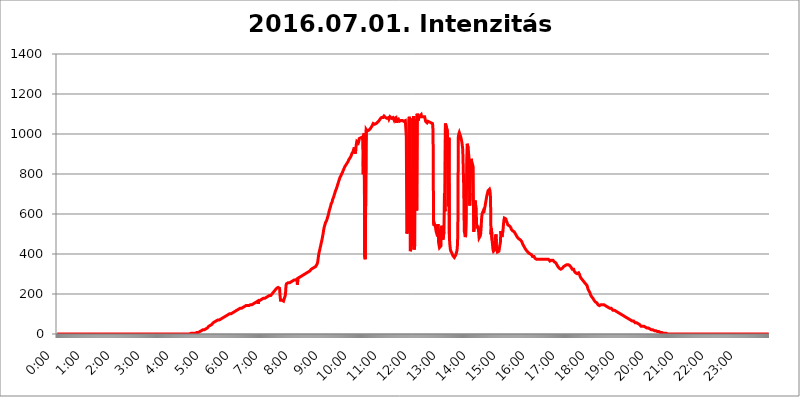
| Category | 2016.07.01. Intenzitás [W/m^2] |
|---|---|
| 0.0 | 0 |
| 0.0006944444444444445 | 0 |
| 0.001388888888888889 | 0 |
| 0.0020833333333333333 | 0 |
| 0.002777777777777778 | 0 |
| 0.003472222222222222 | 0 |
| 0.004166666666666667 | 0 |
| 0.004861111111111111 | 0 |
| 0.005555555555555556 | 0 |
| 0.0062499999999999995 | 0 |
| 0.006944444444444444 | 0 |
| 0.007638888888888889 | 0 |
| 0.008333333333333333 | 0 |
| 0.009027777777777779 | 0 |
| 0.009722222222222222 | 0 |
| 0.010416666666666666 | 0 |
| 0.011111111111111112 | 0 |
| 0.011805555555555555 | 0 |
| 0.012499999999999999 | 0 |
| 0.013194444444444444 | 0 |
| 0.013888888888888888 | 0 |
| 0.014583333333333332 | 0 |
| 0.015277777777777777 | 0 |
| 0.015972222222222224 | 0 |
| 0.016666666666666666 | 0 |
| 0.017361111111111112 | 0 |
| 0.018055555555555557 | 0 |
| 0.01875 | 0 |
| 0.019444444444444445 | 0 |
| 0.02013888888888889 | 0 |
| 0.020833333333333332 | 0 |
| 0.02152777777777778 | 0 |
| 0.022222222222222223 | 0 |
| 0.02291666666666667 | 0 |
| 0.02361111111111111 | 0 |
| 0.024305555555555556 | 0 |
| 0.024999999999999998 | 0 |
| 0.025694444444444447 | 0 |
| 0.02638888888888889 | 0 |
| 0.027083333333333334 | 0 |
| 0.027777777777777776 | 0 |
| 0.02847222222222222 | 0 |
| 0.029166666666666664 | 0 |
| 0.029861111111111113 | 0 |
| 0.030555555555555555 | 0 |
| 0.03125 | 0 |
| 0.03194444444444445 | 0 |
| 0.03263888888888889 | 0 |
| 0.03333333333333333 | 0 |
| 0.034027777777777775 | 0 |
| 0.034722222222222224 | 0 |
| 0.035416666666666666 | 0 |
| 0.036111111111111115 | 0 |
| 0.03680555555555556 | 0 |
| 0.0375 | 0 |
| 0.03819444444444444 | 0 |
| 0.03888888888888889 | 0 |
| 0.03958333333333333 | 0 |
| 0.04027777777777778 | 0 |
| 0.04097222222222222 | 0 |
| 0.041666666666666664 | 0 |
| 0.042361111111111106 | 0 |
| 0.04305555555555556 | 0 |
| 0.043750000000000004 | 0 |
| 0.044444444444444446 | 0 |
| 0.04513888888888889 | 0 |
| 0.04583333333333334 | 0 |
| 0.04652777777777778 | 0 |
| 0.04722222222222222 | 0 |
| 0.04791666666666666 | 0 |
| 0.04861111111111111 | 0 |
| 0.049305555555555554 | 0 |
| 0.049999999999999996 | 0 |
| 0.05069444444444445 | 0 |
| 0.051388888888888894 | 0 |
| 0.052083333333333336 | 0 |
| 0.05277777777777778 | 0 |
| 0.05347222222222222 | 0 |
| 0.05416666666666667 | 0 |
| 0.05486111111111111 | 0 |
| 0.05555555555555555 | 0 |
| 0.05625 | 0 |
| 0.05694444444444444 | 0 |
| 0.057638888888888885 | 0 |
| 0.05833333333333333 | 0 |
| 0.05902777777777778 | 0 |
| 0.059722222222222225 | 0 |
| 0.06041666666666667 | 0 |
| 0.061111111111111116 | 0 |
| 0.06180555555555556 | 0 |
| 0.0625 | 0 |
| 0.06319444444444444 | 0 |
| 0.06388888888888888 | 0 |
| 0.06458333333333334 | 0 |
| 0.06527777777777778 | 0 |
| 0.06597222222222222 | 0 |
| 0.06666666666666667 | 0 |
| 0.06736111111111111 | 0 |
| 0.06805555555555555 | 0 |
| 0.06874999999999999 | 0 |
| 0.06944444444444443 | 0 |
| 0.07013888888888889 | 0 |
| 0.07083333333333333 | 0 |
| 0.07152777777777779 | 0 |
| 0.07222222222222223 | 0 |
| 0.07291666666666667 | 0 |
| 0.07361111111111111 | 0 |
| 0.07430555555555556 | 0 |
| 0.075 | 0 |
| 0.07569444444444444 | 0 |
| 0.0763888888888889 | 0 |
| 0.07708333333333334 | 0 |
| 0.07777777777777778 | 0 |
| 0.07847222222222222 | 0 |
| 0.07916666666666666 | 0 |
| 0.0798611111111111 | 0 |
| 0.08055555555555556 | 0 |
| 0.08125 | 0 |
| 0.08194444444444444 | 0 |
| 0.08263888888888889 | 0 |
| 0.08333333333333333 | 0 |
| 0.08402777777777777 | 0 |
| 0.08472222222222221 | 0 |
| 0.08541666666666665 | 0 |
| 0.08611111111111112 | 0 |
| 0.08680555555555557 | 0 |
| 0.08750000000000001 | 0 |
| 0.08819444444444445 | 0 |
| 0.08888888888888889 | 0 |
| 0.08958333333333333 | 0 |
| 0.09027777777777778 | 0 |
| 0.09097222222222222 | 0 |
| 0.09166666666666667 | 0 |
| 0.09236111111111112 | 0 |
| 0.09305555555555556 | 0 |
| 0.09375 | 0 |
| 0.09444444444444444 | 0 |
| 0.09513888888888888 | 0 |
| 0.09583333333333333 | 0 |
| 0.09652777777777777 | 0 |
| 0.09722222222222222 | 0 |
| 0.09791666666666667 | 0 |
| 0.09861111111111111 | 0 |
| 0.09930555555555555 | 0 |
| 0.09999999999999999 | 0 |
| 0.10069444444444443 | 0 |
| 0.1013888888888889 | 0 |
| 0.10208333333333335 | 0 |
| 0.10277777777777779 | 0 |
| 0.10347222222222223 | 0 |
| 0.10416666666666667 | 0 |
| 0.10486111111111111 | 0 |
| 0.10555555555555556 | 0 |
| 0.10625 | 0 |
| 0.10694444444444444 | 0 |
| 0.1076388888888889 | 0 |
| 0.10833333333333334 | 0 |
| 0.10902777777777778 | 0 |
| 0.10972222222222222 | 0 |
| 0.1111111111111111 | 0 |
| 0.11180555555555556 | 0 |
| 0.11180555555555556 | 0 |
| 0.1125 | 0 |
| 0.11319444444444444 | 0 |
| 0.11388888888888889 | 0 |
| 0.11458333333333333 | 0 |
| 0.11527777777777777 | 0 |
| 0.11597222222222221 | 0 |
| 0.11666666666666665 | 0 |
| 0.1173611111111111 | 0 |
| 0.11805555555555557 | 0 |
| 0.11944444444444445 | 0 |
| 0.12013888888888889 | 0 |
| 0.12083333333333333 | 0 |
| 0.12152777777777778 | 0 |
| 0.12222222222222223 | 0 |
| 0.12291666666666667 | 0 |
| 0.12291666666666667 | 0 |
| 0.12361111111111112 | 0 |
| 0.12430555555555556 | 0 |
| 0.125 | 0 |
| 0.12569444444444444 | 0 |
| 0.12638888888888888 | 0 |
| 0.12708333333333333 | 0 |
| 0.16875 | 0 |
| 0.12847222222222224 | 0 |
| 0.12916666666666668 | 0 |
| 0.12986111111111112 | 0 |
| 0.13055555555555556 | 0 |
| 0.13125 | 0 |
| 0.13194444444444445 | 0 |
| 0.1326388888888889 | 0 |
| 0.13333333333333333 | 0 |
| 0.13402777777777777 | 0 |
| 0.13402777777777777 | 0 |
| 0.13472222222222222 | 0 |
| 0.13541666666666666 | 0 |
| 0.1361111111111111 | 0 |
| 0.13749999999999998 | 0 |
| 0.13819444444444443 | 0 |
| 0.1388888888888889 | 0 |
| 0.13958333333333334 | 0 |
| 0.14027777777777778 | 0 |
| 0.14097222222222222 | 0 |
| 0.14166666666666666 | 0 |
| 0.1423611111111111 | 0 |
| 0.14305555555555557 | 0 |
| 0.14375000000000002 | 0 |
| 0.14444444444444446 | 0 |
| 0.1451388888888889 | 0 |
| 0.1451388888888889 | 0 |
| 0.14652777777777778 | 0 |
| 0.14722222222222223 | 0 |
| 0.14791666666666667 | 0 |
| 0.1486111111111111 | 0 |
| 0.14930555555555555 | 0 |
| 0.15 | 0 |
| 0.15069444444444444 | 0 |
| 0.15138888888888888 | 0 |
| 0.15208333333333332 | 0 |
| 0.15277777777777776 | 0 |
| 0.15347222222222223 | 0 |
| 0.15416666666666667 | 0 |
| 0.15486111111111112 | 0 |
| 0.15555555555555556 | 0 |
| 0.15625 | 0 |
| 0.15694444444444444 | 0 |
| 0.15763888888888888 | 0 |
| 0.15833333333333333 | 0 |
| 0.15902777777777777 | 0 |
| 0.15972222222222224 | 0 |
| 0.16041666666666668 | 0 |
| 0.16111111111111112 | 0 |
| 0.16180555555555556 | 0 |
| 0.1625 | 0 |
| 0.16319444444444445 | 0 |
| 0.1638888888888889 | 0 |
| 0.16458333333333333 | 0 |
| 0.16527777777777777 | 0 |
| 0.16597222222222222 | 0 |
| 0.16666666666666666 | 0 |
| 0.1673611111111111 | 0 |
| 0.16805555555555554 | 0 |
| 0.16874999999999998 | 0 |
| 0.16944444444444443 | 0 |
| 0.17013888888888887 | 0 |
| 0.1708333333333333 | 0 |
| 0.17152777777777775 | 0 |
| 0.17222222222222225 | 0 |
| 0.1729166666666667 | 0 |
| 0.17361111111111113 | 0 |
| 0.17430555555555557 | 0 |
| 0.17500000000000002 | 0 |
| 0.17569444444444446 | 0 |
| 0.1763888888888889 | 0 |
| 0.17708333333333334 | 0 |
| 0.17777777777777778 | 0 |
| 0.17847222222222223 | 0 |
| 0.17916666666666667 | 0 |
| 0.1798611111111111 | 0 |
| 0.18055555555555555 | 0 |
| 0.18125 | 0 |
| 0.18194444444444444 | 0 |
| 0.1826388888888889 | 0 |
| 0.18333333333333335 | 0 |
| 0.1840277777777778 | 0 |
| 0.18472222222222223 | 0 |
| 0.18541666666666667 | 0 |
| 0.18611111111111112 | 0 |
| 0.18680555555555556 | 0 |
| 0.1875 | 3.525 |
| 0.18819444444444444 | 3.525 |
| 0.18888888888888888 | 3.525 |
| 0.18958333333333333 | 3.525 |
| 0.19027777777777777 | 3.525 |
| 0.1909722222222222 | 3.525 |
| 0.19166666666666665 | 3.525 |
| 0.19236111111111112 | 3.525 |
| 0.19305555555555554 | 3.525 |
| 0.19375 | 3.525 |
| 0.19444444444444445 | 7.887 |
| 0.1951388888888889 | 7.887 |
| 0.19583333333333333 | 7.887 |
| 0.19652777777777777 | 7.887 |
| 0.19722222222222222 | 7.887 |
| 0.19791666666666666 | 7.887 |
| 0.1986111111111111 | 12.257 |
| 0.19930555555555554 | 12.257 |
| 0.19999999999999998 | 12.257 |
| 0.20069444444444443 | 12.257 |
| 0.20138888888888887 | 12.257 |
| 0.2020833333333333 | 16.636 |
| 0.2027777777777778 | 16.636 |
| 0.2034722222222222 | 16.636 |
| 0.2041666666666667 | 21.024 |
| 0.20486111111111113 | 21.024 |
| 0.20555555555555557 | 21.024 |
| 0.20625000000000002 | 21.024 |
| 0.20694444444444446 | 21.024 |
| 0.2076388888888889 | 21.024 |
| 0.20833333333333334 | 25.419 |
| 0.20902777777777778 | 25.419 |
| 0.20972222222222223 | 25.419 |
| 0.21041666666666667 | 29.823 |
| 0.2111111111111111 | 34.234 |
| 0.21180555555555555 | 34.234 |
| 0.2125 | 38.653 |
| 0.21319444444444444 | 38.653 |
| 0.2138888888888889 | 43.079 |
| 0.21458333333333335 | 43.079 |
| 0.2152777777777778 | 47.511 |
| 0.21597222222222223 | 47.511 |
| 0.21666666666666667 | 47.511 |
| 0.21736111111111112 | 51.951 |
| 0.21805555555555556 | 51.951 |
| 0.21875 | 56.398 |
| 0.21944444444444444 | 56.398 |
| 0.22013888888888888 | 56.398 |
| 0.22083333333333333 | 60.85 |
| 0.22152777777777777 | 60.85 |
| 0.2222222222222222 | 60.85 |
| 0.22291666666666665 | 65.31 |
| 0.2236111111111111 | 65.31 |
| 0.22430555555555556 | 65.31 |
| 0.225 | 69.775 |
| 0.22569444444444445 | 69.775 |
| 0.2263888888888889 | 69.775 |
| 0.22708333333333333 | 69.775 |
| 0.22777777777777777 | 74.246 |
| 0.22847222222222222 | 74.246 |
| 0.22916666666666666 | 74.246 |
| 0.2298611111111111 | 74.246 |
| 0.23055555555555554 | 78.722 |
| 0.23124999999999998 | 78.722 |
| 0.23194444444444443 | 78.722 |
| 0.23263888888888887 | 83.205 |
| 0.2333333333333333 | 83.205 |
| 0.2340277777777778 | 83.205 |
| 0.2347222222222222 | 83.205 |
| 0.2354166666666667 | 87.692 |
| 0.23611111111111113 | 87.692 |
| 0.23680555555555557 | 87.692 |
| 0.23750000000000002 | 92.184 |
| 0.23819444444444446 | 92.184 |
| 0.2388888888888889 | 92.184 |
| 0.23958333333333334 | 96.682 |
| 0.24027777777777778 | 96.682 |
| 0.24097222222222223 | 96.682 |
| 0.24166666666666667 | 101.184 |
| 0.2423611111111111 | 101.184 |
| 0.24305555555555555 | 101.184 |
| 0.24375 | 101.184 |
| 0.24444444444444446 | 105.69 |
| 0.24513888888888888 | 105.69 |
| 0.24583333333333335 | 105.69 |
| 0.2465277777777778 | 110.201 |
| 0.24722222222222223 | 110.201 |
| 0.24791666666666667 | 110.201 |
| 0.24861111111111112 | 110.201 |
| 0.24930555555555556 | 114.716 |
| 0.25 | 114.716 |
| 0.25069444444444444 | 114.716 |
| 0.2513888888888889 | 114.716 |
| 0.2520833333333333 | 119.235 |
| 0.25277777777777777 | 119.235 |
| 0.2534722222222222 | 119.235 |
| 0.25416666666666665 | 123.758 |
| 0.2548611111111111 | 123.758 |
| 0.2555555555555556 | 128.284 |
| 0.25625000000000003 | 128.284 |
| 0.2569444444444445 | 128.284 |
| 0.2576388888888889 | 128.284 |
| 0.25833333333333336 | 128.284 |
| 0.2590277777777778 | 132.814 |
| 0.25972222222222224 | 132.814 |
| 0.2604166666666667 | 132.814 |
| 0.2611111111111111 | 137.347 |
| 0.26180555555555557 | 137.347 |
| 0.2625 | 137.347 |
| 0.26319444444444445 | 137.347 |
| 0.2638888888888889 | 137.347 |
| 0.26458333333333334 | 141.884 |
| 0.2652777777777778 | 141.884 |
| 0.2659722222222222 | 141.884 |
| 0.26666666666666666 | 141.884 |
| 0.2673611111111111 | 141.884 |
| 0.26805555555555555 | 141.884 |
| 0.26875 | 141.884 |
| 0.26944444444444443 | 141.884 |
| 0.2701388888888889 | 141.884 |
| 0.2708333333333333 | 146.423 |
| 0.27152777777777776 | 146.423 |
| 0.2722222222222222 | 146.423 |
| 0.27291666666666664 | 146.423 |
| 0.2736111111111111 | 146.423 |
| 0.2743055555555555 | 146.423 |
| 0.27499999999999997 | 150.964 |
| 0.27569444444444446 | 150.964 |
| 0.27638888888888885 | 155.509 |
| 0.27708333333333335 | 155.509 |
| 0.2777777777777778 | 155.509 |
| 0.27847222222222223 | 155.509 |
| 0.2791666666666667 | 160.056 |
| 0.2798611111111111 | 160.056 |
| 0.28055555555555556 | 160.056 |
| 0.28125 | 164.605 |
| 0.28194444444444444 | 150.964 |
| 0.2826388888888889 | 164.605 |
| 0.2833333333333333 | 164.605 |
| 0.28402777777777777 | 169.156 |
| 0.2847222222222222 | 169.156 |
| 0.28541666666666665 | 173.709 |
| 0.28611111111111115 | 173.709 |
| 0.28680555555555554 | 173.709 |
| 0.28750000000000003 | 173.709 |
| 0.2881944444444445 | 173.709 |
| 0.2888888888888889 | 178.264 |
| 0.28958333333333336 | 178.264 |
| 0.2902777777777778 | 178.264 |
| 0.29097222222222224 | 178.264 |
| 0.2916666666666667 | 182.82 |
| 0.2923611111111111 | 182.82 |
| 0.29305555555555557 | 182.82 |
| 0.29375 | 182.82 |
| 0.29444444444444445 | 182.82 |
| 0.2951388888888889 | 187.378 |
| 0.29583333333333334 | 187.378 |
| 0.2965277777777778 | 191.937 |
| 0.2972222222222222 | 191.937 |
| 0.29791666666666666 | 191.937 |
| 0.2986111111111111 | 191.937 |
| 0.29930555555555555 | 191.937 |
| 0.3 | 196.497 |
| 0.30069444444444443 | 196.497 |
| 0.3013888888888889 | 201.058 |
| 0.3020833333333333 | 201.058 |
| 0.30277777777777776 | 205.62 |
| 0.3034722222222222 | 210.182 |
| 0.30416666666666664 | 210.182 |
| 0.3048611111111111 | 214.746 |
| 0.3055555555555555 | 219.309 |
| 0.30624999999999997 | 219.309 |
| 0.3069444444444444 | 223.873 |
| 0.3076388888888889 | 228.436 |
| 0.30833333333333335 | 228.436 |
| 0.3090277777777778 | 233 |
| 0.30972222222222223 | 233 |
| 0.3104166666666667 | 233 |
| 0.3111111111111111 | 233 |
| 0.31180555555555556 | 228.436 |
| 0.3125 | 191.937 |
| 0.31319444444444444 | 169.156 |
| 0.3138888888888889 | 169.156 |
| 0.3145833333333333 | 173.709 |
| 0.31527777777777777 | 169.156 |
| 0.3159722222222222 | 173.709 |
| 0.31666666666666665 | 164.605 |
| 0.31736111111111115 | 164.605 |
| 0.31805555555555554 | 173.709 |
| 0.31875000000000003 | 178.264 |
| 0.3194444444444445 | 187.378 |
| 0.3201388888888889 | 201.058 |
| 0.32083333333333336 | 242.127 |
| 0.3215277777777778 | 251.251 |
| 0.32222222222222224 | 246.689 |
| 0.3229166666666667 | 255.813 |
| 0.3236111111111111 | 255.813 |
| 0.32430555555555557 | 255.813 |
| 0.325 | 255.813 |
| 0.32569444444444445 | 255.813 |
| 0.3263888888888889 | 255.813 |
| 0.32708333333333334 | 260.373 |
| 0.3277777777777778 | 260.373 |
| 0.3284722222222222 | 264.932 |
| 0.32916666666666666 | 264.932 |
| 0.3298611111111111 | 264.932 |
| 0.33055555555555555 | 269.49 |
| 0.33125 | 269.49 |
| 0.33194444444444443 | 269.49 |
| 0.3326388888888889 | 269.49 |
| 0.3333333333333333 | 269.49 |
| 0.3340277777777778 | 269.49 |
| 0.3347222222222222 | 274.047 |
| 0.3354166666666667 | 274.047 |
| 0.3361111111111111 | 274.047 |
| 0.3368055555555556 | 246.689 |
| 0.33749999999999997 | 278.603 |
| 0.33819444444444446 | 278.603 |
| 0.33888888888888885 | 283.156 |
| 0.33958333333333335 | 283.156 |
| 0.34027777777777773 | 287.709 |
| 0.34097222222222223 | 287.709 |
| 0.3416666666666666 | 287.709 |
| 0.3423611111111111 | 287.709 |
| 0.3430555555555555 | 292.259 |
| 0.34375 | 292.259 |
| 0.3444444444444445 | 296.808 |
| 0.3451388888888889 | 296.808 |
| 0.3458333333333334 | 296.808 |
| 0.34652777777777777 | 296.808 |
| 0.34722222222222227 | 301.354 |
| 0.34791666666666665 | 301.354 |
| 0.34861111111111115 | 305.898 |
| 0.34930555555555554 | 305.898 |
| 0.35000000000000003 | 305.898 |
| 0.3506944444444444 | 305.898 |
| 0.3513888888888889 | 310.44 |
| 0.3520833333333333 | 310.44 |
| 0.3527777777777778 | 314.98 |
| 0.3534722222222222 | 314.98 |
| 0.3541666666666667 | 314.98 |
| 0.3548611111111111 | 319.517 |
| 0.35555555555555557 | 319.517 |
| 0.35625 | 324.052 |
| 0.35694444444444445 | 324.052 |
| 0.3576388888888889 | 324.052 |
| 0.35833333333333334 | 328.584 |
| 0.3590277777777778 | 328.584 |
| 0.3597222222222222 | 328.584 |
| 0.36041666666666666 | 333.113 |
| 0.3611111111111111 | 333.113 |
| 0.36180555555555555 | 337.639 |
| 0.3625 | 337.639 |
| 0.36319444444444443 | 342.162 |
| 0.3638888888888889 | 342.162 |
| 0.3645833333333333 | 351.198 |
| 0.3652777777777778 | 360.221 |
| 0.3659722222222222 | 378.224 |
| 0.3666666666666667 | 396.164 |
| 0.3673611111111111 | 409.574 |
| 0.3680555555555556 | 418.492 |
| 0.36874999999999997 | 431.833 |
| 0.36944444444444446 | 440.702 |
| 0.37013888888888885 | 453.968 |
| 0.37083333333333335 | 462.786 |
| 0.37152777777777773 | 475.972 |
| 0.37222222222222223 | 489.108 |
| 0.3729166666666666 | 502.192 |
| 0.3736111111111111 | 519.555 |
| 0.3743055555555555 | 532.513 |
| 0.375 | 541.121 |
| 0.3756944444444445 | 549.704 |
| 0.3763888888888889 | 558.261 |
| 0.3770833333333334 | 562.53 |
| 0.37777777777777777 | 566.793 |
| 0.37847222222222227 | 575.299 |
| 0.37916666666666665 | 583.779 |
| 0.37986111111111115 | 592.233 |
| 0.38055555555555554 | 600.661 |
| 0.38125000000000003 | 613.252 |
| 0.3819444444444444 | 621.613 |
| 0.3826388888888889 | 625.784 |
| 0.3833333333333333 | 638.256 |
| 0.3840277777777778 | 650.667 |
| 0.3847222222222222 | 654.791 |
| 0.3854166666666667 | 658.909 |
| 0.3861111111111111 | 671.22 |
| 0.38680555555555557 | 675.311 |
| 0.3875 | 683.473 |
| 0.38819444444444445 | 691.608 |
| 0.3888888888888889 | 699.717 |
| 0.38958333333333334 | 703.762 |
| 0.3902777777777778 | 715.858 |
| 0.3909722222222222 | 719.877 |
| 0.39166666666666666 | 727.896 |
| 0.3923611111111111 | 735.89 |
| 0.39305555555555555 | 743.859 |
| 0.39375 | 751.803 |
| 0.39444444444444443 | 755.766 |
| 0.3951388888888889 | 767.62 |
| 0.3958333333333333 | 771.559 |
| 0.3965277777777778 | 783.342 |
| 0.3972222222222222 | 787.258 |
| 0.3979166666666667 | 791.169 |
| 0.3986111111111111 | 798.974 |
| 0.3993055555555556 | 802.868 |
| 0.39999999999999997 | 806.757 |
| 0.40069444444444446 | 814.519 |
| 0.40138888888888885 | 818.392 |
| 0.40208333333333335 | 826.123 |
| 0.40277777777777773 | 829.981 |
| 0.40347222222222223 | 837.682 |
| 0.4041666666666666 | 841.526 |
| 0.4048611111111111 | 845.365 |
| 0.4055555555555555 | 849.199 |
| 0.40625 | 853.029 |
| 0.4069444444444445 | 853.029 |
| 0.4076388888888889 | 860.676 |
| 0.4083333333333334 | 864.493 |
| 0.40902777777777777 | 872.114 |
| 0.40972222222222227 | 875.918 |
| 0.41041666666666665 | 879.719 |
| 0.41111111111111115 | 883.516 |
| 0.41180555555555554 | 887.309 |
| 0.41250000000000003 | 894.885 |
| 0.4131944444444444 | 902.447 |
| 0.4138888888888889 | 906.223 |
| 0.4145833333333333 | 909.996 |
| 0.4152777777777778 | 917.534 |
| 0.4159722222222222 | 925.06 |
| 0.4166666666666667 | 932.576 |
| 0.4173611111111111 | 936.33 |
| 0.41805555555555557 | 902.447 |
| 0.41875 | 925.06 |
| 0.41944444444444445 | 947.58 |
| 0.4201388888888889 | 962.555 |
| 0.42083333333333334 | 962.555 |
| 0.4215277777777778 | 966.295 |
| 0.4222222222222222 | 955.071 |
| 0.42291666666666666 | 962.555 |
| 0.4236111111111111 | 977.508 |
| 0.42430555555555555 | 973.772 |
| 0.425 | 981.244 |
| 0.42569444444444443 | 981.244 |
| 0.4263888888888889 | 977.508 |
| 0.4270833333333333 | 977.508 |
| 0.4277777777777778 | 984.98 |
| 0.4284722222222222 | 966.295 |
| 0.4291666666666667 | 798.974 |
| 0.4298611111111111 | 996.182 |
| 0.4305555555555556 | 1003.65 |
| 0.43124999999999997 | 387.202 |
| 0.43194444444444446 | 373.729 |
| 0.43263888888888885 | 369.23 |
| 0.43333333333333335 | 1022.323 |
| 0.43402777777777773 | 1022.323 |
| 0.43472222222222223 | 1014.852 |
| 0.4354166666666666 | 1018.587 |
| 0.4361111111111111 | 1014.852 |
| 0.4368055555555555 | 1018.587 |
| 0.4375 | 1022.323 |
| 0.4381944444444445 | 1022.323 |
| 0.4388888888888889 | 1026.06 |
| 0.4395833333333334 | 1029.798 |
| 0.44027777777777777 | 1033.537 |
| 0.44097222222222227 | 1037.277 |
| 0.44166666666666665 | 1041.019 |
| 0.44236111111111115 | 1044.762 |
| 0.44305555555555554 | 1052.255 |
| 0.44375000000000003 | 1052.255 |
| 0.4444444444444444 | 1048.508 |
| 0.4451388888888889 | 1048.508 |
| 0.4458333333333333 | 1048.508 |
| 0.4465277777777778 | 1048.508 |
| 0.4472222222222222 | 1052.255 |
| 0.4479166666666667 | 1052.255 |
| 0.4486111111111111 | 1056.004 |
| 0.44930555555555557 | 1059.756 |
| 0.45 | 1059.756 |
| 0.45069444444444445 | 1063.51 |
| 0.4513888888888889 | 1067.267 |
| 0.45208333333333334 | 1071.027 |
| 0.4527777777777778 | 1074.789 |
| 0.4534722222222222 | 1078.555 |
| 0.45416666666666666 | 1078.555 |
| 0.4548611111111111 | 1082.324 |
| 0.45555555555555555 | 1082.324 |
| 0.45625 | 1082.324 |
| 0.45694444444444443 | 1082.324 |
| 0.4576388888888889 | 1086.097 |
| 0.4583333333333333 | 1089.873 |
| 0.4590277777777778 | 1093.653 |
| 0.4597222222222222 | 1086.097 |
| 0.4604166666666667 | 1082.324 |
| 0.4611111111111111 | 1082.324 |
| 0.4618055555555556 | 1082.324 |
| 0.46249999999999997 | 1078.555 |
| 0.46319444444444446 | 1078.555 |
| 0.46388888888888885 | 1082.324 |
| 0.46458333333333335 | 1082.324 |
| 0.46527777777777773 | 1074.789 |
| 0.46597222222222223 | 1078.555 |
| 0.4666666666666666 | 1086.097 |
| 0.4673611111111111 | 1086.097 |
| 0.4680555555555555 | 1086.097 |
| 0.46875 | 1078.555 |
| 0.4694444444444445 | 1078.555 |
| 0.4701388888888889 | 1078.555 |
| 0.4708333333333334 | 1082.324 |
| 0.47152777777777777 | 1078.555 |
| 0.47222222222222227 | 1071.027 |
| 0.47291666666666665 | 1078.555 |
| 0.47361111111111115 | 1082.324 |
| 0.47430555555555554 | 1082.324 |
| 0.47500000000000003 | 1082.324 |
| 0.4756944444444444 | 1056.004 |
| 0.4763888888888889 | 1071.027 |
| 0.4770833333333333 | 1071.027 |
| 0.4777777777777778 | 1074.789 |
| 0.4784722222222222 | 1074.789 |
| 0.4791666666666667 | 1071.027 |
| 0.4798611111111111 | 1063.51 |
| 0.48055555555555557 | 1063.51 |
| 0.48125 | 1063.51 |
| 0.48194444444444445 | 1067.267 |
| 0.4826388888888889 | 1067.267 |
| 0.48333333333333334 | 1067.267 |
| 0.4840277777777778 | 1067.267 |
| 0.4847222222222222 | 1063.51 |
| 0.48541666666666666 | 1063.51 |
| 0.4861111111111111 | 1063.51 |
| 0.48680555555555555 | 1067.267 |
| 0.4875 | 1067.267 |
| 0.48819444444444443 | 1067.267 |
| 0.4888888888888889 | 1071.027 |
| 0.4895833333333333 | 984.98 |
| 0.4902777777777778 | 502.192 |
| 0.4909722222222222 | 510.885 |
| 0.4916666666666667 | 506.542 |
| 0.4923611111111111 | 532.513 |
| 0.4930555555555556 | 1071.027 |
| 0.49374999999999997 | 1086.097 |
| 0.49444444444444446 | 1067.267 |
| 0.49513888888888885 | 414.035 |
| 0.49583333333333335 | 418.492 |
| 0.49652777777777773 | 431.833 |
| 0.49722222222222223 | 458.38 |
| 0.4979166666666666 | 515.223 |
| 0.4986111111111111 | 1078.555 |
| 0.4993055555555555 | 826.123 |
| 0.5 | 1089.873 |
| 0.5006944444444444 | 422.943 |
| 0.5013888888888889 | 445.129 |
| 0.5020833333333333 | 1063.51 |
| 0.5027777777777778 | 1074.789 |
| 0.5034722222222222 | 917.534 |
| 0.5041666666666667 | 617.436 |
| 0.5048611111111111 | 1101.226 |
| 0.5055555555555555 | 1101.226 |
| 0.50625 | 1067.267 |
| 0.5069444444444444 | 1078.555 |
| 0.5076388888888889 | 1082.324 |
| 0.5083333333333333 | 1089.873 |
| 0.5090277777777777 | 1093.653 |
| 0.5097222222222222 | 1089.873 |
| 0.5104166666666666 | 1097.437 |
| 0.5111111111111112 | 1086.097 |
| 0.5118055555555555 | 1086.097 |
| 0.5125000000000001 | 1082.324 |
| 0.5131944444444444 | 1086.097 |
| 0.513888888888889 | 1086.097 |
| 0.5145833333333333 | 1086.097 |
| 0.5152777777777778 | 1086.097 |
| 0.5159722222222222 | 1082.324 |
| 0.5166666666666667 | 1063.51 |
| 0.517361111111111 | 1063.51 |
| 0.5180555555555556 | 1059.756 |
| 0.5187499999999999 | 1056.004 |
| 0.5194444444444445 | 1059.756 |
| 0.5201388888888888 | 1063.51 |
| 0.5208333333333334 | 1063.51 |
| 0.5215277777777778 | 1059.756 |
| 0.5222222222222223 | 1059.756 |
| 0.5229166666666667 | 1056.004 |
| 0.5236111111111111 | 1056.004 |
| 0.5243055555555556 | 1056.004 |
| 0.525 | 1059.756 |
| 0.5256944444444445 | 1059.756 |
| 0.5263888888888889 | 1052.255 |
| 0.5270833333333333 | 1014.852 |
| 0.5277777777777778 | 553.986 |
| 0.5284722222222222 | 541.121 |
| 0.5291666666666667 | 549.704 |
| 0.5298611111111111 | 545.416 |
| 0.5305555555555556 | 532.513 |
| 0.53125 | 515.223 |
| 0.5319444444444444 | 506.542 |
| 0.5326388888888889 | 506.542 |
| 0.5333333333333333 | 519.555 |
| 0.5340277777777778 | 549.704 |
| 0.5347222222222222 | 462.786 |
| 0.5354166666666667 | 445.129 |
| 0.5361111111111111 | 431.833 |
| 0.5368055555555555 | 427.39 |
| 0.5375 | 431.833 |
| 0.5381944444444444 | 440.702 |
| 0.5388888888888889 | 541.121 |
| 0.5395833333333333 | 519.555 |
| 0.5402777777777777 | 480.356 |
| 0.5409722222222222 | 471.582 |
| 0.5416666666666666 | 471.582 |
| 0.5423611111111112 | 510.885 |
| 0.5430555555555555 | 703.762 |
| 0.5437500000000001 | 613.252 |
| 0.5444444444444444 | 1052.255 |
| 0.545138888888889 | 1048.508 |
| 0.5458333333333333 | 1033.537 |
| 0.5465277777777778 | 1026.06 |
| 0.5472222222222222 | 1018.587 |
| 0.5479166666666667 | 1022.323 |
| 0.548611111111111 | 638.256 |
| 0.5493055555555556 | 981.244 |
| 0.5499999999999999 | 480.356 |
| 0.5506944444444445 | 445.129 |
| 0.5513888888888888 | 422.943 |
| 0.5520833333333334 | 414.035 |
| 0.5527777777777778 | 409.574 |
| 0.5534722222222223 | 405.108 |
| 0.5541666666666667 | 400.638 |
| 0.5548611111111111 | 391.685 |
| 0.5555555555555556 | 387.202 |
| 0.55625 | 387.202 |
| 0.5569444444444445 | 382.715 |
| 0.5576388888888889 | 387.202 |
| 0.5583333333333333 | 387.202 |
| 0.5590277777777778 | 396.164 |
| 0.5597222222222222 | 405.108 |
| 0.5604166666666667 | 414.035 |
| 0.5611111111111111 | 431.833 |
| 0.5618055555555556 | 497.836 |
| 0.5625 | 984.98 |
| 0.5631944444444444 | 999.916 |
| 0.5638888888888889 | 1007.383 |
| 0.5645833333333333 | 1007.383 |
| 0.5652777777777778 | 992.448 |
| 0.5659722222222222 | 984.98 |
| 0.5666666666666667 | 973.772 |
| 0.5673611111111111 | 962.555 |
| 0.5680555555555555 | 943.832 |
| 0.56875 | 921.298 |
| 0.5694444444444444 | 917.534 |
| 0.5701388888888889 | 731.896 |
| 0.5708333333333333 | 515.223 |
| 0.5715277777777777 | 502.192 |
| 0.5722222222222222 | 484.735 |
| 0.5729166666666666 | 493.475 |
| 0.5736111111111112 | 558.261 |
| 0.5743055555555555 | 868.305 |
| 0.5750000000000001 | 951.327 |
| 0.5756944444444444 | 947.58 |
| 0.576388888888889 | 928.819 |
| 0.5770833333333333 | 894.885 |
| 0.5777777777777778 | 872.114 |
| 0.5784722222222222 | 642.4 |
| 0.5791666666666667 | 703.762 |
| 0.579861111111111 | 853.029 |
| 0.5805555555555556 | 875.918 |
| 0.5812499999999999 | 864.493 |
| 0.5819444444444445 | 860.676 |
| 0.5826388888888888 | 845.365 |
| 0.5833333333333334 | 833.834 |
| 0.5840277777777778 | 510.885 |
| 0.5847222222222223 | 523.88 |
| 0.5854166666666667 | 629.948 |
| 0.5861111111111111 | 667.123 |
| 0.5868055555555556 | 667.123 |
| 0.5875 | 617.436 |
| 0.5881944444444445 | 549.704 |
| 0.5888888888888889 | 528.2 |
| 0.5895833333333333 | 541.121 |
| 0.5902777777777778 | 532.513 |
| 0.5909722222222222 | 510.885 |
| 0.5916666666666667 | 480.356 |
| 0.5923611111111111 | 480.356 |
| 0.5930555555555556 | 489.108 |
| 0.59375 | 497.836 |
| 0.5944444444444444 | 528.2 |
| 0.5951388888888889 | 575.299 |
| 0.5958333333333333 | 600.661 |
| 0.5965277777777778 | 596.45 |
| 0.5972222222222222 | 613.252 |
| 0.5979166666666667 | 604.864 |
| 0.5986111111111111 | 617.436 |
| 0.5993055555555555 | 625.784 |
| 0.6 | 638.256 |
| 0.6006944444444444 | 654.791 |
| 0.6013888888888889 | 667.123 |
| 0.6020833333333333 | 683.473 |
| 0.6027777777777777 | 695.666 |
| 0.6034722222222222 | 703.762 |
| 0.6041666666666666 | 715.858 |
| 0.6048611111111112 | 719.877 |
| 0.6055555555555555 | 719.877 |
| 0.6062500000000001 | 723.889 |
| 0.6069444444444444 | 715.858 |
| 0.607638888888889 | 683.473 |
| 0.6083333333333333 | 497.836 |
| 0.6090277777777778 | 528.2 |
| 0.6097222222222222 | 471.582 |
| 0.6104166666666667 | 449.551 |
| 0.611111111111111 | 422.943 |
| 0.6118055555555556 | 414.035 |
| 0.6124999999999999 | 418.492 |
| 0.6131944444444445 | 414.035 |
| 0.6138888888888888 | 422.943 |
| 0.6145833333333334 | 480.356 |
| 0.6152777777777778 | 497.836 |
| 0.6159722222222223 | 436.27 |
| 0.6166666666666667 | 418.492 |
| 0.6173611111111111 | 409.574 |
| 0.6180555555555556 | 405.108 |
| 0.61875 | 405.108 |
| 0.6194444444444445 | 414.035 |
| 0.6201388888888889 | 418.492 |
| 0.6208333333333333 | 445.129 |
| 0.6215277777777778 | 458.38 |
| 0.6222222222222222 | 515.223 |
| 0.6229166666666667 | 515.223 |
| 0.6236111111111111 | 484.735 |
| 0.6243055555555556 | 502.192 |
| 0.625 | 510.885 |
| 0.6256944444444444 | 541.121 |
| 0.6263888888888889 | 566.793 |
| 0.6270833333333333 | 579.542 |
| 0.6277777777777778 | 583.779 |
| 0.6284722222222222 | 583.779 |
| 0.6291666666666667 | 575.299 |
| 0.6298611111111111 | 566.793 |
| 0.6305555555555555 | 562.53 |
| 0.63125 | 553.986 |
| 0.6319444444444444 | 545.416 |
| 0.6326388888888889 | 541.121 |
| 0.6333333333333333 | 541.121 |
| 0.6340277777777777 | 541.121 |
| 0.6347222222222222 | 536.82 |
| 0.6354166666666666 | 536.82 |
| 0.6361111111111112 | 532.513 |
| 0.6368055555555555 | 523.88 |
| 0.6375000000000001 | 523.88 |
| 0.6381944444444444 | 519.555 |
| 0.638888888888889 | 515.223 |
| 0.6395833333333333 | 515.223 |
| 0.6402777777777778 | 515.223 |
| 0.6409722222222222 | 510.885 |
| 0.6416666666666667 | 506.542 |
| 0.642361111111111 | 502.192 |
| 0.6430555555555556 | 497.836 |
| 0.6437499999999999 | 493.475 |
| 0.6444444444444445 | 489.108 |
| 0.6451388888888888 | 484.735 |
| 0.6458333333333334 | 480.356 |
| 0.6465277777777778 | 480.356 |
| 0.6472222222222223 | 475.972 |
| 0.6479166666666667 | 471.582 |
| 0.6486111111111111 | 471.582 |
| 0.6493055555555556 | 471.582 |
| 0.65 | 467.187 |
| 0.6506944444444445 | 467.187 |
| 0.6513888888888889 | 462.786 |
| 0.6520833333333333 | 458.38 |
| 0.6527777777777778 | 449.551 |
| 0.6534722222222222 | 445.129 |
| 0.6541666666666667 | 440.702 |
| 0.6548611111111111 | 436.27 |
| 0.6555555555555556 | 431.833 |
| 0.65625 | 427.39 |
| 0.6569444444444444 | 422.943 |
| 0.6576388888888889 | 422.943 |
| 0.6583333333333333 | 418.492 |
| 0.6590277777777778 | 414.035 |
| 0.6597222222222222 | 414.035 |
| 0.6604166666666667 | 409.574 |
| 0.6611111111111111 | 405.108 |
| 0.6618055555555555 | 400.638 |
| 0.6625 | 400.638 |
| 0.6631944444444444 | 400.638 |
| 0.6638888888888889 | 396.164 |
| 0.6645833333333333 | 396.164 |
| 0.6652777777777777 | 396.164 |
| 0.6659722222222222 | 391.685 |
| 0.6666666666666666 | 387.202 |
| 0.6673611111111111 | 387.202 |
| 0.6680555555555556 | 387.202 |
| 0.6687500000000001 | 387.202 |
| 0.6694444444444444 | 382.715 |
| 0.6701388888888888 | 378.224 |
| 0.6708333333333334 | 378.224 |
| 0.6715277777777778 | 378.224 |
| 0.6722222222222222 | 373.729 |
| 0.6729166666666666 | 373.729 |
| 0.6736111111111112 | 373.729 |
| 0.6743055555555556 | 373.729 |
| 0.6749999999999999 | 373.729 |
| 0.6756944444444444 | 373.729 |
| 0.6763888888888889 | 373.729 |
| 0.6770833333333334 | 369.23 |
| 0.6777777777777777 | 373.729 |
| 0.6784722222222223 | 373.729 |
| 0.6791666666666667 | 373.729 |
| 0.6798611111111111 | 373.729 |
| 0.6805555555555555 | 373.729 |
| 0.68125 | 373.729 |
| 0.6819444444444445 | 373.729 |
| 0.6826388888888889 | 373.729 |
| 0.6833333333333332 | 373.729 |
| 0.6840277777777778 | 373.729 |
| 0.6847222222222222 | 373.729 |
| 0.6854166666666667 | 373.729 |
| 0.686111111111111 | 373.729 |
| 0.6868055555555556 | 373.729 |
| 0.6875 | 373.729 |
| 0.6881944444444444 | 373.729 |
| 0.688888888888889 | 373.729 |
| 0.6895833333333333 | 369.23 |
| 0.6902777777777778 | 369.23 |
| 0.6909722222222222 | 364.728 |
| 0.6916666666666668 | 364.728 |
| 0.6923611111111111 | 364.728 |
| 0.6930555555555555 | 369.23 |
| 0.69375 | 369.23 |
| 0.6944444444444445 | 369.23 |
| 0.6951388888888889 | 369.23 |
| 0.6958333333333333 | 364.728 |
| 0.6965277777777777 | 364.728 |
| 0.6972222222222223 | 360.221 |
| 0.6979166666666666 | 360.221 |
| 0.6986111111111111 | 360.221 |
| 0.6993055555555556 | 355.712 |
| 0.7000000000000001 | 351.198 |
| 0.7006944444444444 | 346.682 |
| 0.7013888888888888 | 342.162 |
| 0.7020833333333334 | 337.639 |
| 0.7027777777777778 | 333.113 |
| 0.7034722222222222 | 333.113 |
| 0.7041666666666666 | 328.584 |
| 0.7048611111111112 | 328.584 |
| 0.7055555555555556 | 328.584 |
| 0.7062499999999999 | 324.052 |
| 0.7069444444444444 | 328.584 |
| 0.7076388888888889 | 324.052 |
| 0.7083333333333334 | 328.584 |
| 0.7090277777777777 | 333.113 |
| 0.7097222222222223 | 333.113 |
| 0.7104166666666667 | 337.639 |
| 0.7111111111111111 | 337.639 |
| 0.7118055555555555 | 337.639 |
| 0.7125 | 342.162 |
| 0.7131944444444445 | 342.162 |
| 0.7138888888888889 | 342.162 |
| 0.7145833333333332 | 346.682 |
| 0.7152777777777778 | 346.682 |
| 0.7159722222222222 | 346.682 |
| 0.7166666666666667 | 346.682 |
| 0.717361111111111 | 346.682 |
| 0.7180555555555556 | 342.162 |
| 0.71875 | 342.162 |
| 0.7194444444444444 | 342.162 |
| 0.720138888888889 | 337.639 |
| 0.7208333333333333 | 333.113 |
| 0.7215277777777778 | 328.584 |
| 0.7222222222222222 | 324.052 |
| 0.7229166666666668 | 319.517 |
| 0.7236111111111111 | 319.517 |
| 0.7243055555555555 | 324.052 |
| 0.725 | 314.98 |
| 0.7256944444444445 | 314.98 |
| 0.7263888888888889 | 310.44 |
| 0.7270833333333333 | 305.898 |
| 0.7277777777777777 | 301.354 |
| 0.7284722222222223 | 301.354 |
| 0.7291666666666666 | 301.354 |
| 0.7298611111111111 | 301.354 |
| 0.7305555555555556 | 305.898 |
| 0.7312500000000001 | 305.898 |
| 0.7319444444444444 | 301.354 |
| 0.7326388888888888 | 296.808 |
| 0.7333333333333334 | 287.709 |
| 0.7340277777777778 | 283.156 |
| 0.7347222222222222 | 278.603 |
| 0.7354166666666666 | 274.047 |
| 0.7361111111111112 | 274.047 |
| 0.7368055555555556 | 269.49 |
| 0.7374999999999999 | 269.49 |
| 0.7381944444444444 | 264.932 |
| 0.7388888888888889 | 260.373 |
| 0.7395833333333334 | 255.813 |
| 0.7402777777777777 | 255.813 |
| 0.7409722222222223 | 251.251 |
| 0.7416666666666667 | 251.251 |
| 0.7423611111111111 | 246.689 |
| 0.7430555555555555 | 242.127 |
| 0.74375 | 233 |
| 0.7444444444444445 | 223.873 |
| 0.7451388888888889 | 219.309 |
| 0.7458333333333332 | 214.746 |
| 0.7465277777777778 | 210.182 |
| 0.7472222222222222 | 205.62 |
| 0.7479166666666667 | 196.497 |
| 0.748611111111111 | 191.937 |
| 0.7493055555555556 | 187.378 |
| 0.75 | 182.82 |
| 0.7506944444444444 | 182.82 |
| 0.751388888888889 | 178.264 |
| 0.7520833333333333 | 173.709 |
| 0.7527777777777778 | 169.156 |
| 0.7534722222222222 | 164.605 |
| 0.7541666666666668 | 164.605 |
| 0.7548611111111111 | 160.056 |
| 0.7555555555555555 | 160.056 |
| 0.75625 | 160.056 |
| 0.7569444444444445 | 155.509 |
| 0.7576388888888889 | 150.964 |
| 0.7583333333333333 | 146.423 |
| 0.7590277777777777 | 146.423 |
| 0.7597222222222223 | 146.423 |
| 0.7604166666666666 | 141.884 |
| 0.7611111111111111 | 141.884 |
| 0.7618055555555556 | 141.884 |
| 0.7625000000000001 | 146.423 |
| 0.7631944444444444 | 146.423 |
| 0.7638888888888888 | 146.423 |
| 0.7645833333333334 | 146.423 |
| 0.7652777777777778 | 146.423 |
| 0.7659722222222222 | 146.423 |
| 0.7666666666666666 | 146.423 |
| 0.7673611111111112 | 146.423 |
| 0.7680555555555556 | 141.884 |
| 0.7687499999999999 | 141.884 |
| 0.7694444444444444 | 141.884 |
| 0.7701388888888889 | 137.347 |
| 0.7708333333333334 | 137.347 |
| 0.7715277777777777 | 137.347 |
| 0.7722222222222223 | 132.814 |
| 0.7729166666666667 | 132.814 |
| 0.7736111111111111 | 132.814 |
| 0.7743055555555555 | 128.284 |
| 0.775 | 128.284 |
| 0.7756944444444445 | 128.284 |
| 0.7763888888888889 | 128.284 |
| 0.7770833333333332 | 128.284 |
| 0.7777777777777778 | 123.758 |
| 0.7784722222222222 | 123.758 |
| 0.7791666666666667 | 119.235 |
| 0.779861111111111 | 119.235 |
| 0.7805555555555556 | 119.235 |
| 0.78125 | 119.235 |
| 0.7819444444444444 | 114.716 |
| 0.782638888888889 | 114.716 |
| 0.7833333333333333 | 114.716 |
| 0.7840277777777778 | 110.201 |
| 0.7847222222222222 | 110.201 |
| 0.7854166666666668 | 110.201 |
| 0.7861111111111111 | 110.201 |
| 0.7868055555555555 | 105.69 |
| 0.7875 | 105.69 |
| 0.7881944444444445 | 105.69 |
| 0.7888888888888889 | 101.184 |
| 0.7895833333333333 | 101.184 |
| 0.7902777777777777 | 101.184 |
| 0.7909722222222223 | 96.682 |
| 0.7916666666666666 | 96.682 |
| 0.7923611111111111 | 96.682 |
| 0.7930555555555556 | 92.184 |
| 0.7937500000000001 | 92.184 |
| 0.7944444444444444 | 92.184 |
| 0.7951388888888888 | 92.184 |
| 0.7958333333333334 | 87.692 |
| 0.7965277777777778 | 87.692 |
| 0.7972222222222222 | 83.205 |
| 0.7979166666666666 | 83.205 |
| 0.7986111111111112 | 83.205 |
| 0.7993055555555556 | 83.205 |
| 0.7999999999999999 | 78.722 |
| 0.8006944444444444 | 78.722 |
| 0.8013888888888889 | 78.722 |
| 0.8020833333333334 | 74.246 |
| 0.8027777777777777 | 74.246 |
| 0.8034722222222223 | 74.246 |
| 0.8041666666666667 | 69.775 |
| 0.8048611111111111 | 69.775 |
| 0.8055555555555555 | 69.775 |
| 0.80625 | 65.31 |
| 0.8069444444444445 | 65.31 |
| 0.8076388888888889 | 65.31 |
| 0.8083333333333332 | 65.31 |
| 0.8090277777777778 | 60.85 |
| 0.8097222222222222 | 60.85 |
| 0.8104166666666667 | 56.398 |
| 0.811111111111111 | 56.398 |
| 0.8118055555555556 | 56.398 |
| 0.8125 | 56.398 |
| 0.8131944444444444 | 51.951 |
| 0.813888888888889 | 51.951 |
| 0.8145833333333333 | 51.951 |
| 0.8152777777777778 | 47.511 |
| 0.8159722222222222 | 47.511 |
| 0.8166666666666668 | 47.511 |
| 0.8173611111111111 | 43.079 |
| 0.8180555555555555 | 43.079 |
| 0.81875 | 38.653 |
| 0.8194444444444445 | 38.653 |
| 0.8201388888888889 | 38.653 |
| 0.8208333333333333 | 38.653 |
| 0.8215277777777777 | 38.653 |
| 0.8222222222222223 | 38.653 |
| 0.8229166666666666 | 38.653 |
| 0.8236111111111111 | 34.234 |
| 0.8243055555555556 | 34.234 |
| 0.8250000000000001 | 34.234 |
| 0.8256944444444444 | 34.234 |
| 0.8263888888888888 | 29.823 |
| 0.8270833333333334 | 29.823 |
| 0.8277777777777778 | 29.823 |
| 0.8284722222222222 | 29.823 |
| 0.8291666666666666 | 29.823 |
| 0.8298611111111112 | 29.823 |
| 0.8305555555555556 | 25.419 |
| 0.8312499999999999 | 25.419 |
| 0.8319444444444444 | 25.419 |
| 0.8326388888888889 | 25.419 |
| 0.8333333333333334 | 21.024 |
| 0.8340277777777777 | 21.024 |
| 0.8347222222222223 | 21.024 |
| 0.8354166666666667 | 21.024 |
| 0.8361111111111111 | 21.024 |
| 0.8368055555555555 | 21.024 |
| 0.8375 | 16.636 |
| 0.8381944444444445 | 16.636 |
| 0.8388888888888889 | 16.636 |
| 0.8395833333333332 | 16.636 |
| 0.8402777777777778 | 12.257 |
| 0.8409722222222222 | 12.257 |
| 0.8416666666666667 | 12.257 |
| 0.842361111111111 | 12.257 |
| 0.8430555555555556 | 12.257 |
| 0.84375 | 12.257 |
| 0.8444444444444444 | 12.257 |
| 0.845138888888889 | 7.887 |
| 0.8458333333333333 | 7.887 |
| 0.8465277777777778 | 7.887 |
| 0.8472222222222222 | 7.887 |
| 0.8479166666666668 | 7.887 |
| 0.8486111111111111 | 3.525 |
| 0.8493055555555555 | 3.525 |
| 0.85 | 3.525 |
| 0.8506944444444445 | 3.525 |
| 0.8513888888888889 | 3.525 |
| 0.8520833333333333 | 3.525 |
| 0.8527777777777777 | 3.525 |
| 0.8534722222222223 | 3.525 |
| 0.8541666666666666 | 3.525 |
| 0.8548611111111111 | 0 |
| 0.8555555555555556 | 0 |
| 0.8562500000000001 | 0 |
| 0.8569444444444444 | 0 |
| 0.8576388888888888 | 0 |
| 0.8583333333333334 | 0 |
| 0.8590277777777778 | 0 |
| 0.8597222222222222 | 0 |
| 0.8604166666666666 | 0 |
| 0.8611111111111112 | 0 |
| 0.8618055555555556 | 0 |
| 0.8624999999999999 | 0 |
| 0.8631944444444444 | 0 |
| 0.8638888888888889 | 0 |
| 0.8645833333333334 | 0 |
| 0.8652777777777777 | 0 |
| 0.8659722222222223 | 0 |
| 0.8666666666666667 | 0 |
| 0.8673611111111111 | 0 |
| 0.8680555555555555 | 0 |
| 0.86875 | 0 |
| 0.8694444444444445 | 0 |
| 0.8701388888888889 | 0 |
| 0.8708333333333332 | 0 |
| 0.8715277777777778 | 0 |
| 0.8722222222222222 | 0 |
| 0.8729166666666667 | 0 |
| 0.873611111111111 | 0 |
| 0.8743055555555556 | 0 |
| 0.875 | 0 |
| 0.8756944444444444 | 0 |
| 0.876388888888889 | 0 |
| 0.8770833333333333 | 0 |
| 0.8777777777777778 | 0 |
| 0.8784722222222222 | 0 |
| 0.8791666666666668 | 0 |
| 0.8798611111111111 | 0 |
| 0.8805555555555555 | 0 |
| 0.88125 | 0 |
| 0.8819444444444445 | 0 |
| 0.8826388888888889 | 0 |
| 0.8833333333333333 | 0 |
| 0.8840277777777777 | 0 |
| 0.8847222222222223 | 0 |
| 0.8854166666666666 | 0 |
| 0.8861111111111111 | 0 |
| 0.8868055555555556 | 0 |
| 0.8875000000000001 | 0 |
| 0.8881944444444444 | 0 |
| 0.8888888888888888 | 0 |
| 0.8895833333333334 | 0 |
| 0.8902777777777778 | 0 |
| 0.8909722222222222 | 0 |
| 0.8916666666666666 | 0 |
| 0.8923611111111112 | 0 |
| 0.8930555555555556 | 0 |
| 0.8937499999999999 | 0 |
| 0.8944444444444444 | 0 |
| 0.8951388888888889 | 0 |
| 0.8958333333333334 | 0 |
| 0.8965277777777777 | 0 |
| 0.8972222222222223 | 0 |
| 0.8979166666666667 | 0 |
| 0.8986111111111111 | 0 |
| 0.8993055555555555 | 0 |
| 0.9 | 0 |
| 0.9006944444444445 | 0 |
| 0.9013888888888889 | 0 |
| 0.9020833333333332 | 0 |
| 0.9027777777777778 | 0 |
| 0.9034722222222222 | 0 |
| 0.9041666666666667 | 0 |
| 0.904861111111111 | 0 |
| 0.9055555555555556 | 0 |
| 0.90625 | 0 |
| 0.9069444444444444 | 0 |
| 0.907638888888889 | 0 |
| 0.9083333333333333 | 0 |
| 0.9090277777777778 | 0 |
| 0.9097222222222222 | 0 |
| 0.9104166666666668 | 0 |
| 0.9111111111111111 | 0 |
| 0.9118055555555555 | 0 |
| 0.9125 | 0 |
| 0.9131944444444445 | 0 |
| 0.9138888888888889 | 0 |
| 0.9145833333333333 | 0 |
| 0.9152777777777777 | 0 |
| 0.9159722222222223 | 0 |
| 0.9166666666666666 | 0 |
| 0.9173611111111111 | 0 |
| 0.9180555555555556 | 0 |
| 0.9187500000000001 | 0 |
| 0.9194444444444444 | 0 |
| 0.9201388888888888 | 0 |
| 0.9208333333333334 | 0 |
| 0.9215277777777778 | 0 |
| 0.9222222222222222 | 0 |
| 0.9229166666666666 | 0 |
| 0.9236111111111112 | 0 |
| 0.9243055555555556 | 0 |
| 0.9249999999999999 | 0 |
| 0.9256944444444444 | 0 |
| 0.9263888888888889 | 0 |
| 0.9270833333333334 | 0 |
| 0.9277777777777777 | 0 |
| 0.9284722222222223 | 0 |
| 0.9291666666666667 | 0 |
| 0.9298611111111111 | 0 |
| 0.9305555555555555 | 0 |
| 0.93125 | 0 |
| 0.9319444444444445 | 0 |
| 0.9326388888888889 | 0 |
| 0.9333333333333332 | 0 |
| 0.9340277777777778 | 0 |
| 0.9347222222222222 | 0 |
| 0.9354166666666667 | 0 |
| 0.936111111111111 | 0 |
| 0.9368055555555556 | 0 |
| 0.9375 | 0 |
| 0.9381944444444444 | 0 |
| 0.938888888888889 | 0 |
| 0.9395833333333333 | 0 |
| 0.9402777777777778 | 0 |
| 0.9409722222222222 | 0 |
| 0.9416666666666668 | 0 |
| 0.9423611111111111 | 0 |
| 0.9430555555555555 | 0 |
| 0.94375 | 0 |
| 0.9444444444444445 | 0 |
| 0.9451388888888889 | 0 |
| 0.9458333333333333 | 0 |
| 0.9465277777777777 | 0 |
| 0.9472222222222223 | 0 |
| 0.9479166666666666 | 0 |
| 0.9486111111111111 | 0 |
| 0.9493055555555556 | 0 |
| 0.9500000000000001 | 0 |
| 0.9506944444444444 | 0 |
| 0.9513888888888888 | 0 |
| 0.9520833333333334 | 0 |
| 0.9527777777777778 | 0 |
| 0.9534722222222222 | 0 |
| 0.9541666666666666 | 0 |
| 0.9548611111111112 | 0 |
| 0.9555555555555556 | 0 |
| 0.9562499999999999 | 0 |
| 0.9569444444444444 | 0 |
| 0.9576388888888889 | 0 |
| 0.9583333333333334 | 0 |
| 0.9590277777777777 | 0 |
| 0.9597222222222223 | 0 |
| 0.9604166666666667 | 0 |
| 0.9611111111111111 | 0 |
| 0.9618055555555555 | 0 |
| 0.9625 | 0 |
| 0.9631944444444445 | 0 |
| 0.9638888888888889 | 0 |
| 0.9645833333333332 | 0 |
| 0.9652777777777778 | 0 |
| 0.9659722222222222 | 0 |
| 0.9666666666666667 | 0 |
| 0.967361111111111 | 0 |
| 0.9680555555555556 | 0 |
| 0.96875 | 0 |
| 0.9694444444444444 | 0 |
| 0.970138888888889 | 0 |
| 0.9708333333333333 | 0 |
| 0.9715277777777778 | 0 |
| 0.9722222222222222 | 0 |
| 0.9729166666666668 | 0 |
| 0.9736111111111111 | 0 |
| 0.9743055555555555 | 0 |
| 0.975 | 0 |
| 0.9756944444444445 | 0 |
| 0.9763888888888889 | 0 |
| 0.9770833333333333 | 0 |
| 0.9777777777777777 | 0 |
| 0.9784722222222223 | 0 |
| 0.9791666666666666 | 0 |
| 0.9798611111111111 | 0 |
| 0.9805555555555556 | 0 |
| 0.9812500000000001 | 0 |
| 0.9819444444444444 | 0 |
| 0.9826388888888888 | 0 |
| 0.9833333333333334 | 0 |
| 0.9840277777777778 | 0 |
| 0.9847222222222222 | 0 |
| 0.9854166666666666 | 0 |
| 0.9861111111111112 | 0 |
| 0.9868055555555556 | 0 |
| 0.9874999999999999 | 0 |
| 0.9881944444444444 | 0 |
| 0.9888888888888889 | 0 |
| 0.9895833333333334 | 0 |
| 0.9902777777777777 | 0 |
| 0.9909722222222223 | 0 |
| 0.9916666666666667 | 0 |
| 0.9923611111111111 | 0 |
| 0.9930555555555555 | 0 |
| 0.99375 | 0 |
| 0.9944444444444445 | 0 |
| 0.9951388888888889 | 0 |
| 0.9958333333333332 | 0 |
| 0.9965277777777778 | 0 |
| 0.9972222222222222 | 0 |
| 0.9979166666666667 | 0 |
| 0.998611111111111 | 0 |
| 0.9993055555555556 | 0 |